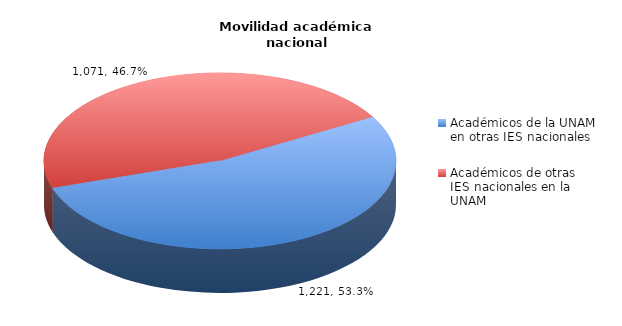
| Category | Series 0 |
|---|---|
| Académicos de la UNAM en otras IES nacionales | 1221 |
| Académicos de otras IES nacionales en la UNAM | 1071 |